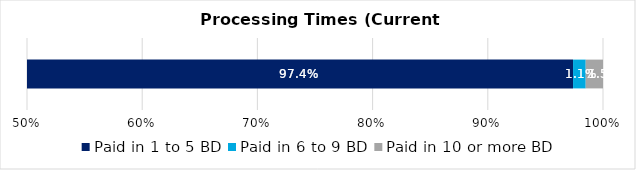
| Category | Paid in 1 to 5 BD | Paid in 6 to 9 BD | Paid in 10 or more BD |
|---|---|---|---|
| 0 | 0.974 | 0.011 | 0.015 |